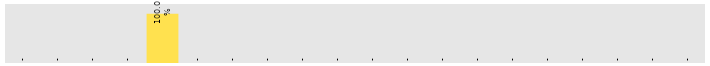
| Category | Friday |
|---|---|
| Accounts | 0 |
| HR | 0 |
| Lobby/Reception | 0 |
| Administration | 0 |
| Customer Support | 1 |
| Finance | 0 |
| Human Resources | 0 |
| IT | 0 |
| Marketing | 0 |
| R&D | 0 |
| Sales | 0 |